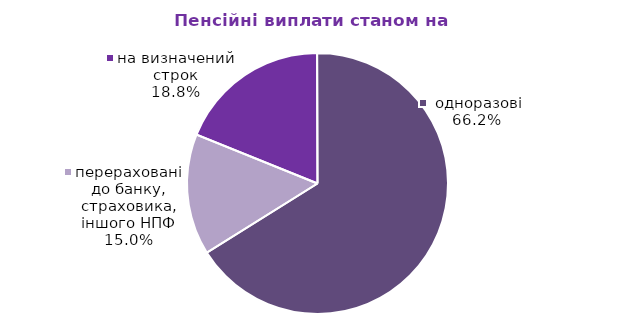
| Category | Series 0 |
|---|---|
| на визначений строк | 119.353 |
|  одноразові | 419.067 |
| перераховані до банку, страховика, іншого НПФ | 95.073 |